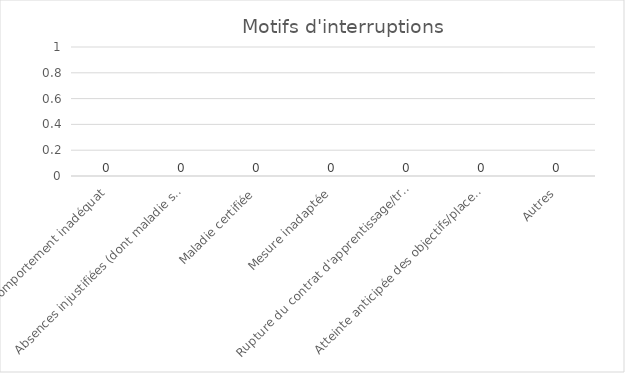
| Category | Series 0 |
|---|---|
| Comportement inadéquat | 0 |
| Absences injustifiées (dont maladie sans certificat médical) | 0 |
| Maladie certifiée | 0 |
| Mesure inadaptée | 0 |
| Rupture du contrat d'apprentissage/travail | 0 |
| Atteinte anticipée des objectifs/placement | 0 |
| Autres | 0 |